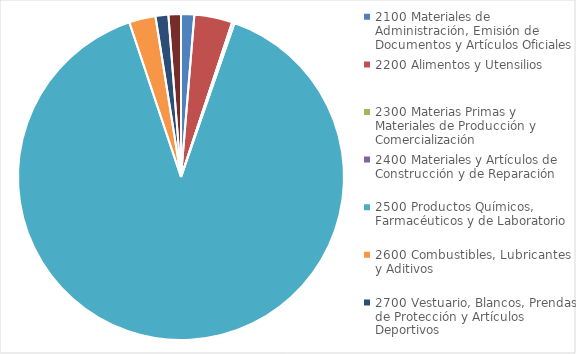
| Category |  Asignado  |
|---|---|
| 2100 Materiales de Administración, Emisión de Documentos y Artículos Oficiales | 30975068.79 |
| 2200 Alimentos y Utensilios | 89378927.7 |
| 2300 Materias Primas y Materiales de Producción y Comercialización | 16777.21 |
| 2400 Materiales y Artículos de Construcción y de Reparación | 5601548.22 |
| 2500 Productos Químicos, Farmacéuticos y de Laboratorio | 2118084037.75 |
| 2600 Combustibles, Lubricantes y Aditivos | 61924035.92 |
| 2700 Vestuario, Blancos, Prendas de Protección y Artículos Deportivos | 30164874 |
| 2900 Herramientas, Refacciones y Accesorios Menores | 29283377.7 |